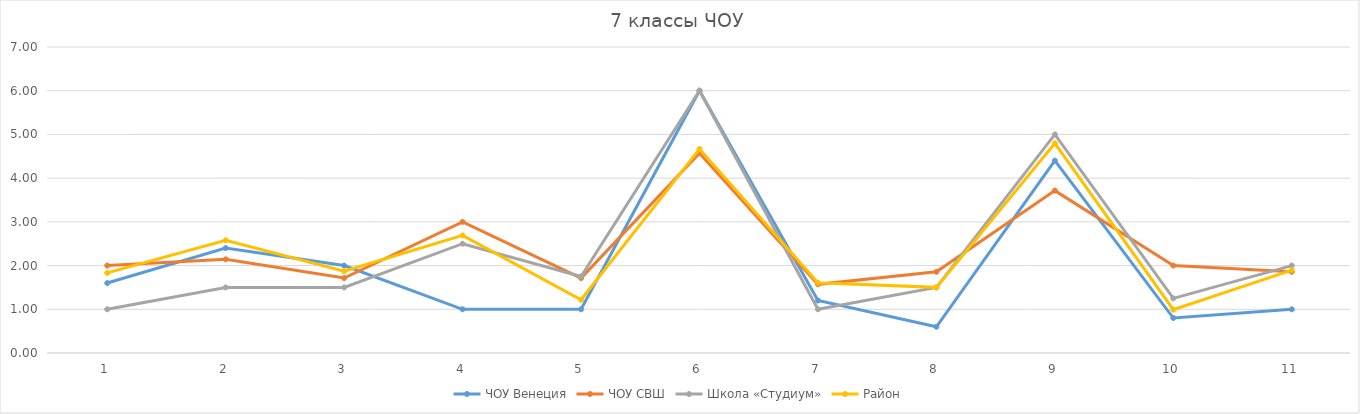
| Category | ЧОУ Венеция | ЧОУ СВШ | Школа «Студиум» | Район |
|---|---|---|---|---|
| 0 | 1.6 | 2 | 1 | 1.833 |
| 1 | 2.4 | 2.143 | 1.5 | 2.576 |
| 2 | 2 | 1.714 | 1.5 | 1.873 |
| 3 | 1 | 3 | 2.5 | 2.689 |
| 4 | 1 | 1.714 | 1.75 | 1.218 |
| 5 | 6 | 4.571 | 6 | 4.665 |
| 6 | 1.2 | 1.571 | 1 | 1.604 |
| 7 | 0.6 | 1.857 | 1.5 | 1.502 |
| 8 | 4.4 | 3.714 | 5 | 4.796 |
| 9 | 0.8 | 2 | 1.25 | 0.991 |
| 10 | 1 | 1.857 | 2 | 1.895 |